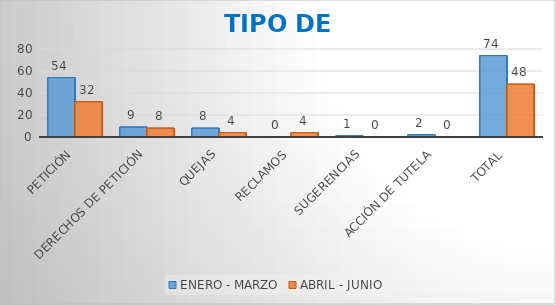
| Category | ENERO - MARZO | ABRIL - JUNIO |
|---|---|---|
| PETICIÓN | 54 | 32 |
| DERECHOS DE PETICIÓN | 9 | 8 |
| QUEJAS | 8 | 4 |
| RECLAMOS | 0 | 4 |
| SUGERENCIAS | 1 | 0 |
| ACCIÓN DE TUTELA | 2 | 0 |
| TOTAL | 74 | 48 |